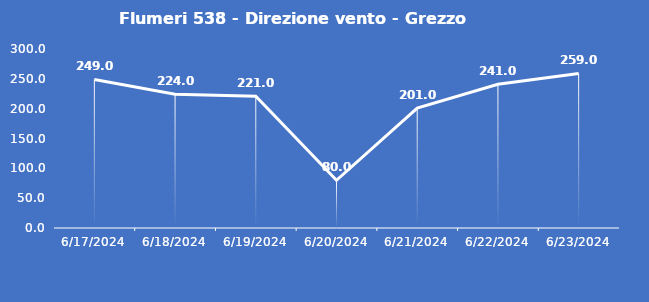
| Category | Flumeri 538 - Direzione vento - Grezzo (°N) |
|---|---|
| 6/17/24 | 249 |
| 6/18/24 | 224 |
| 6/19/24 | 221 |
| 6/20/24 | 80 |
| 6/21/24 | 201 |
| 6/22/24 | 241 |
| 6/23/24 | 259 |